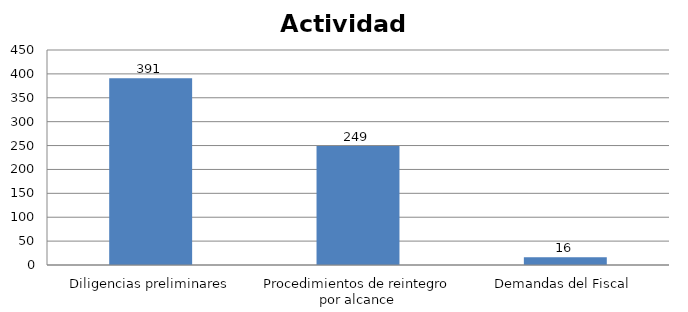
| Category | Series 0 |
|---|---|
| Diligencias preliminares | 391 |
| Procedimientos de reintegro por alcance | 249 |
| Demandas del Fiscal | 16 |